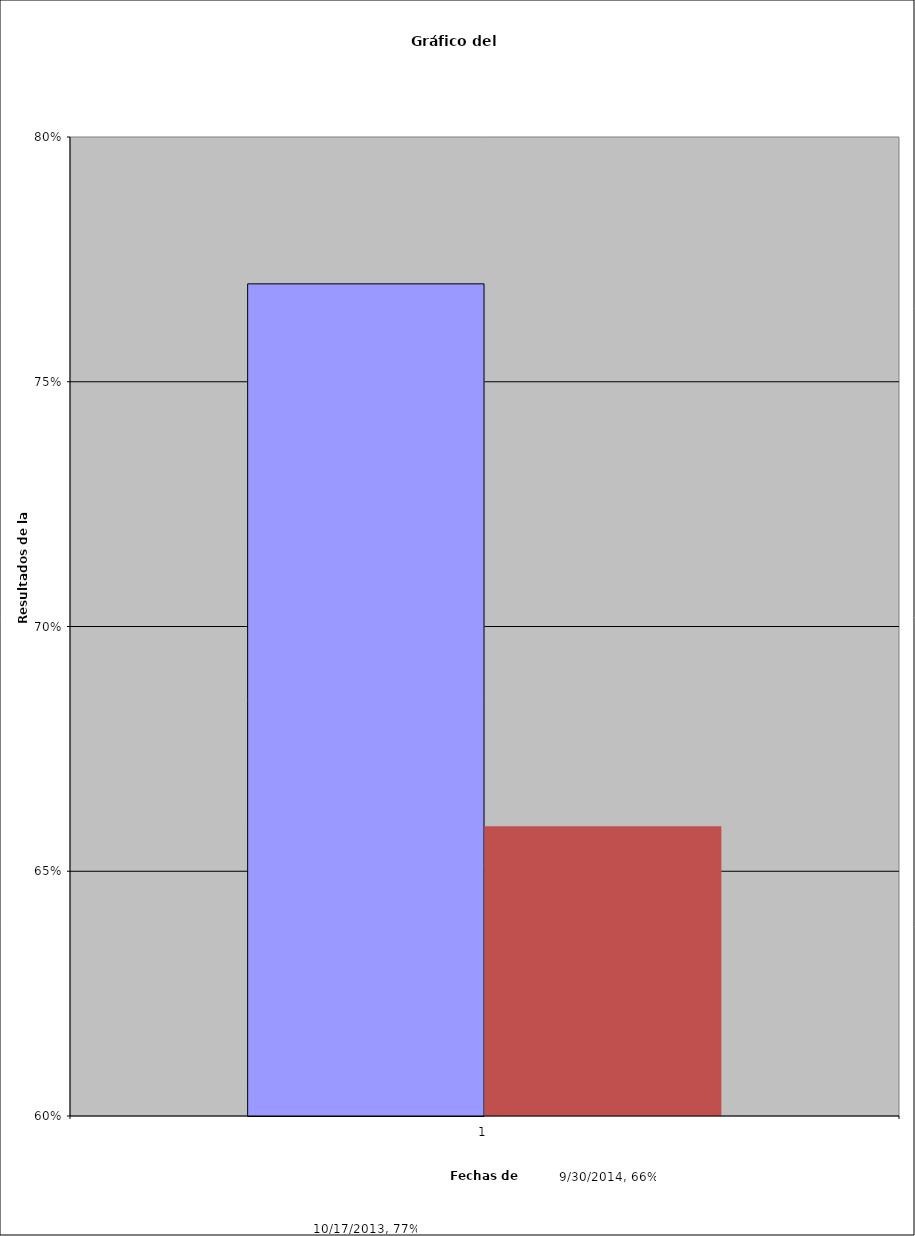
| Category | 17/10/2013 | 30/09/2014 |
|---|---|---|
| 0 | 0.77 | 0.659 |